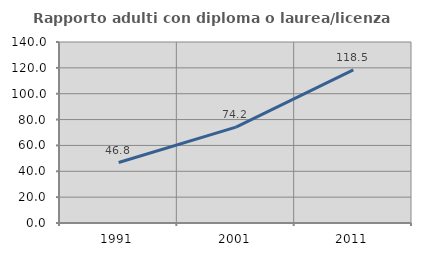
| Category | Rapporto adulti con diploma o laurea/licenza media  |
|---|---|
| 1991.0 | 46.795 |
| 2001.0 | 74.194 |
| 2011.0 | 118.452 |